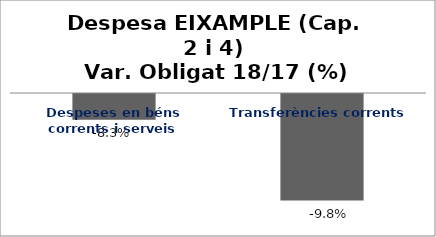
| Category | Series 0 |
|---|---|
| Despeses en béns corrents i serveis | -0.083 |
| Transferències corrents | -0.098 |